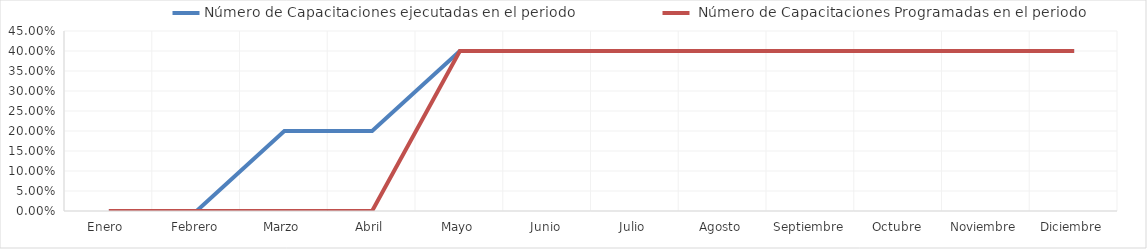
| Category | Número de Capacitaciones ejecutadas en el periodo |  Número de Capacitaciones Programadas en el periodo |
|---|---|---|
| Enero  | 0 | 0 |
| Febrero | 0 | 0 |
| Marzo | 0.2 | 0 |
| Abril | 0.2 | 0 |
| Mayo | 0.4 | 0.4 |
| Junio | 0.4 | 0.4 |
| Julio | 0.4 | 0.4 |
| Agosto | 0.4 | 0.4 |
| Septiembre | 0.4 | 0.4 |
| Octubre | 0.4 | 0.4 |
| Noviembre | 0.4 | 0.4 |
| Diciembre | 0.4 | 0.4 |